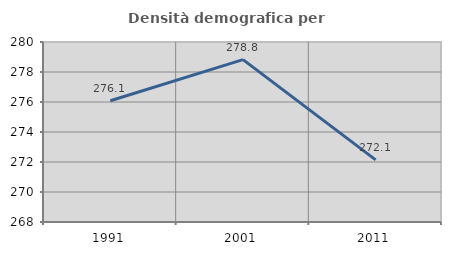
| Category | Densità demografica |
|---|---|
| 1991.0 | 276.082 |
| 2001.0 | 278.823 |
| 2011.0 | 272.138 |